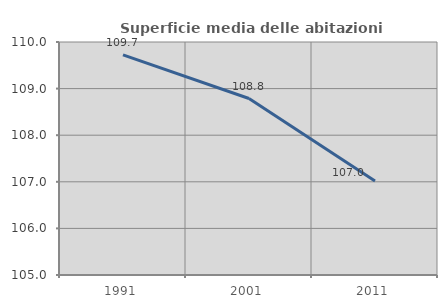
| Category | Superficie media delle abitazioni occupate |
|---|---|
| 1991.0 | 109.725 |
| 2001.0 | 108.787 |
| 2011.0 | 107.019 |